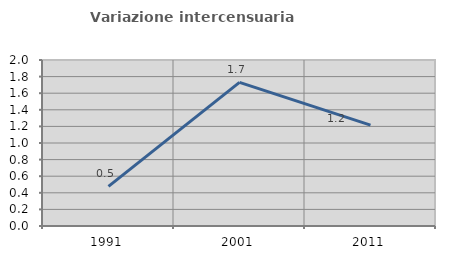
| Category | Variazione intercensuaria annua |
|---|---|
| 1991.0 | 0.477 |
| 2001.0 | 1.73 |
| 2011.0 | 1.216 |